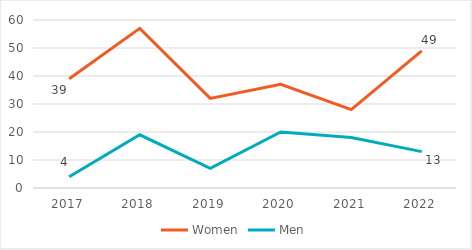
| Category | Women | Men |
|---|---|---|
| 2017.0 | 39 | 4 |
| 2018.0 | 57 | 19 |
| 2019.0 | 32 | 7 |
| 2020.0 | 37 | 20 |
| 2021.0 | 28 | 18 |
| 2022.0 | 49 | 13 |